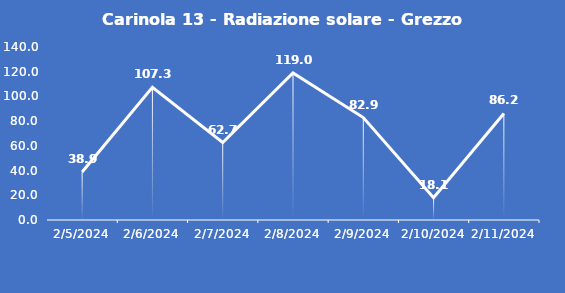
| Category | Carinola 13 - Radiazione solare - Grezzo (W/m2) |
|---|---|
| 2/5/24 | 38.9 |
| 2/6/24 | 107.3 |
| 2/7/24 | 62.7 |
| 2/8/24 | 119 |
| 2/9/24 | 82.9 |
| 2/10/24 | 18.1 |
| 2/11/24 | 86.2 |